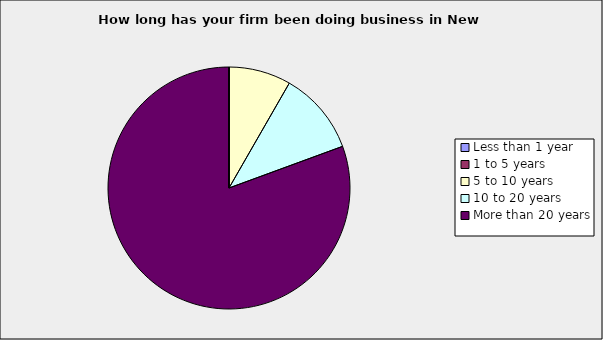
| Category | Series 0 |
|---|---|
| Less than 1 year | 0 |
| 1 to 5 years | 0 |
| 5 to 10 years | 0.083 |
| 10 to 20 years | 0.111 |
| More than 20 years | 0.806 |